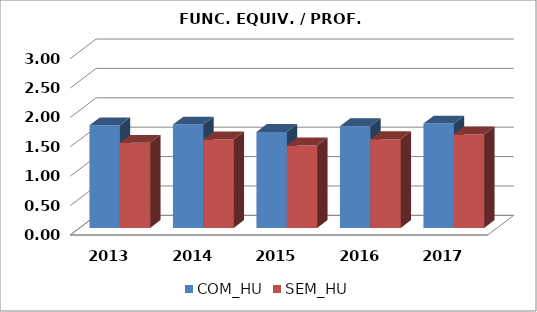
| Category | COM_HU | SEM_HU |
|---|---|---|
| 2013.0 | 1.745 | 1.447 |
| 2014.0 | 1.759 | 1.505 |
| 2015.0 | 1.633 | 1.403 |
| 2016.0 | 1.73 | 1.51 |
| 2017.0 | 1.776 | 1.59 |